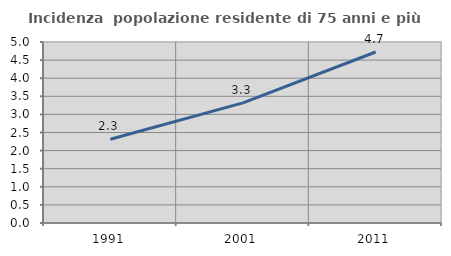
| Category | Incidenza  popolazione residente di 75 anni e più |
|---|---|
| 1991.0 | 2.314 |
| 2001.0 | 3.318 |
| 2011.0 | 4.724 |